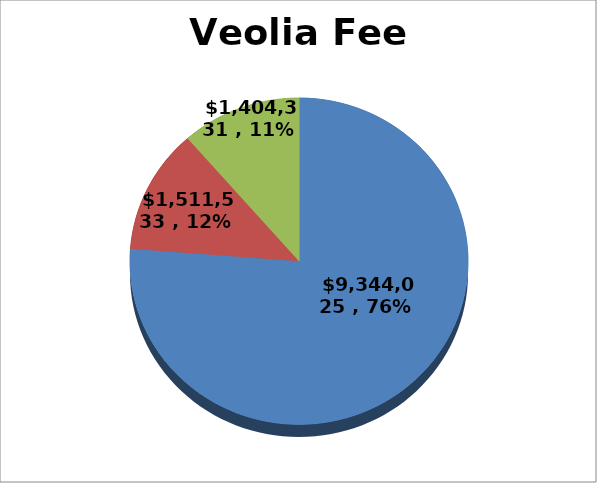
| Category | Series 0 |
|---|---|
| 0 | 9344024.76 |
| 1 | 1511532.77 |
| 2 | 1404331.01 |